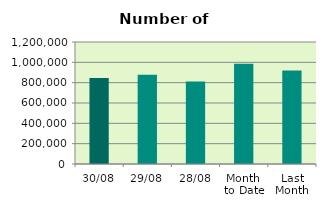
| Category | Series 0 |
|---|---|
| 30/08 | 845156 |
| 29/08 | 878356 |
| 28/08 | 812524 |
| Month 
to Date | 986270.455 |
| Last
Month | 919173.478 |